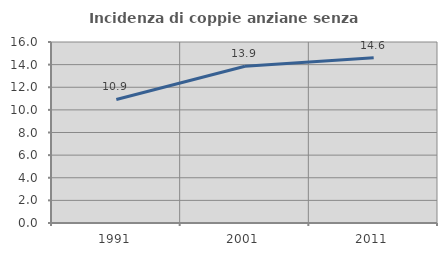
| Category | Incidenza di coppie anziane senza figli  |
|---|---|
| 1991.0 | 10.924 |
| 2001.0 | 13.861 |
| 2011.0 | 14.609 |